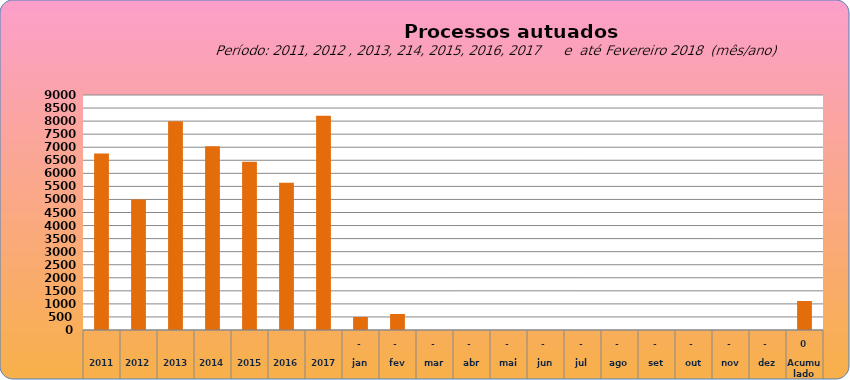
| Category | 6755 |
|---|---|
| 2011 | 6755 |
| 2012 | 4997 |
| 2013 | 7990 |
| 2014 | 7034 |
| 2015 | 6446 |
| 2016 | 5644 |
| 2017 | 8210 |
| jan | 498 |
| fev | 612 |
| mar | 0 |
| abr | 0 |
| mai | 0 |
| jun | 0 |
| jul | 0 |
| ago | 0 |
| set | 0 |
| out | 0 |
| nov | 0 |
| dez | 0 |
| Acumulado
 | 1110 |